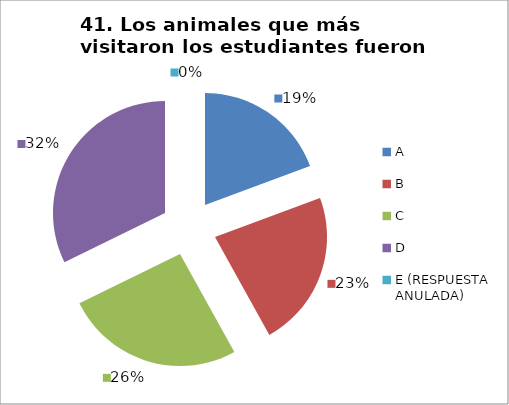
| Category | CANTIDAD DE RESPUESTAS PREGUNTA (41) | PORCENTAJE |
|---|---|---|
| A | 6 | 0.194 |
| B | 7 | 0.226 |
| C | 8 | 0.258 |
| D | 10 | 0.323 |
| E (RESPUESTA ANULADA) | 0 | 0 |